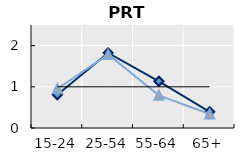
| Category | Né à l'étranger | Né dans le pays | Series 1 |
|---|---|---|---|
| 15-24 | 0.807 | 0.953 | 1 |
| 25-54 | 1.823 | 1.782 | 1 |
| 55-64 | 1.134 | 0.793 | 1 |
| 65+ | 0.394 | 0.34 | 1 |